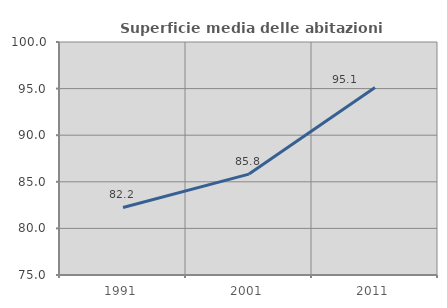
| Category | Superficie media delle abitazioni occupate |
|---|---|
| 1991.0 | 82.244 |
| 2001.0 | 85.829 |
| 2011.0 | 95.129 |